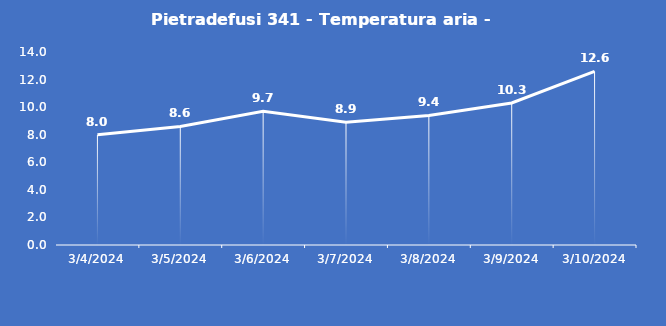
| Category | Pietradefusi 341 - Temperatura aria - Grezzo (°C) |
|---|---|
| 3/4/24 | 8 |
| 3/5/24 | 8.6 |
| 3/6/24 | 9.7 |
| 3/7/24 | 8.9 |
| 3/8/24 | 9.4 |
| 3/9/24 | 10.3 |
| 3/10/24 | 12.6 |